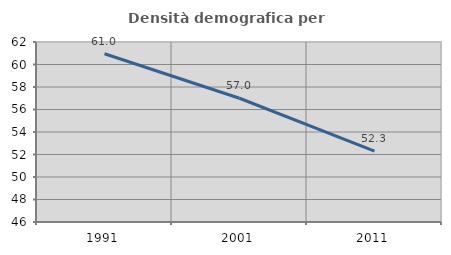
| Category | Densità demografica |
|---|---|
| 1991.0 | 60.952 |
| 2001.0 | 57.001 |
| 2011.0 | 52.298 |